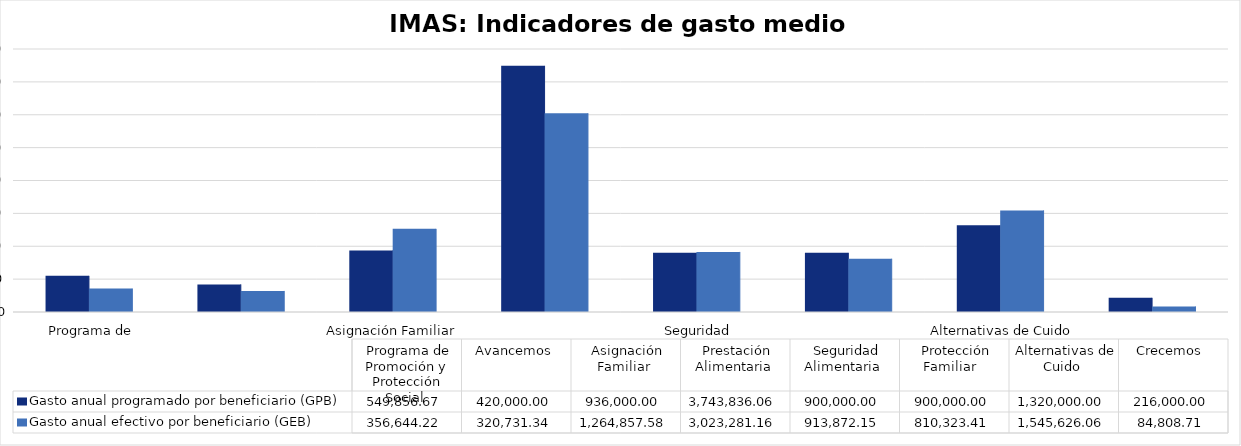
| Category | Gasto anual programado por beneficiario (GPB)  | Gasto anual efectivo por beneficiario (GEB)  |
|---|---|---|
| Programa de Promoción y Protección Social | 549856.674 | 356644.223 |
| Avancemos | 420000 | 320731.342 |
| Asignación Familiar | 936000 | 1264857.575 |
| Prestación Alimentaria | 3743836.059 | 3023281.159 |
| Seguridad Alimentaria | 900000 | 913872.154 |
| Protección Familiar  | 900000 | 810323.411 |
| Alternativas de Cuido | 1320000 | 1545626.057 |
| Crecemos  | 216000 | 84808.705 |